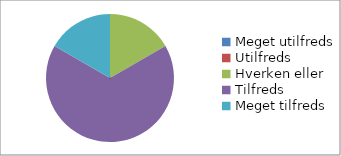
| Category | Hvor tilfreds er du med workshoppen 'Den Syddanske Model of Ingeniøruddannelser'? (n=18) |
|---|---|
| Meget utilfreds | 0 |
| Utilfreds | 0 |
| Hverken eller | 0.167 |
| Tilfreds | 0.667 |
| Meget tilfreds | 0.167 |